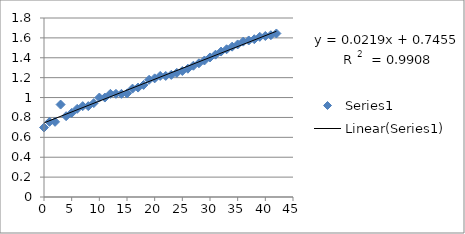
| Category | Series 0 |
|---|---|
| 0.0 | 0.699 |
| 1.0 | 0.756 |
| 2.0 | 0.756 |
| 3.0 | 0.929 |
| 4.0 | 0.813 |
| 5.0 | 0.845 |
| 6.0 | 0.886 |
| 7.0 | 0.914 |
| 8.0 | 0.914 |
| 9.0 | 0.944 |
| 10.0 | 1 |
| 11.0 | 1 |
| 12.0 | 1.037 |
| 13.0 | 1.037 |
| 14.0 | 1.037 |
| 15.0 | 1.041 |
| 16.0 | 1.09 |
| 17.0 | 1.1 |
| 18.0 | 1.127 |
| 19.0 | 1.179 |
| 20.0 | 1.193 |
| 21.0 | 1.217 |
| 22.0 | 1.217 |
| 23.0 | 1.228 |
| 24.0 | 1.248 |
| 25.0 | 1.267 |
| 26.0 | 1.29 |
| 27.0 | 1.32 |
| 28.0 | 1.344 |
| 29.0 | 1.373 |
| 30.0 | 1.403 |
| 31.0 | 1.431 |
| 32.0 | 1.462 |
| 33.0 | 1.486 |
| 34.0 | 1.512 |
| 35.0 | 1.534 |
| 36.0 | 1.562 |
| 37.0 | 1.574 |
| 38.0 | 1.587 |
| 39.0 | 1.611 |
| 40.0 | 1.619 |
| 41.0 | 1.627 |
| 42.0 | 1.644 |